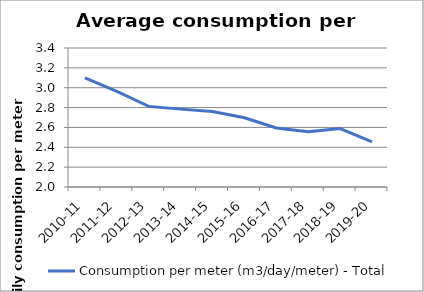
| Category | Consumption per meter (m3/day/meter) - Total |
|---|---|
| 2010-11 | 3.099 |
| 2011-12 | 2.962 |
| 2012-13 | 2.812 |
| 2013-14 | 2.784 |
| 2014-15 | 2.76 |
| 2015-16 | 2.698 |
| 2016-17 | 2.594 |
| 2017-18 | 2.555 |
| 2018-19 | 2.588 |
| 2019-20 | 2.454 |